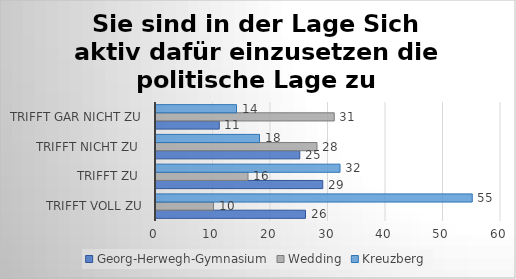
| Category | Georg-Herwegh-Gymnasium | Wedding | Kreuzberg |
|---|---|---|---|
| trifft voll zu | 26 | 10 | 55 |
| trifft zu  | 29 | 16 | 32 |
| trifft nicht zu  | 25 | 28 | 18 |
| trifft gar nicht zu | 11 | 31 | 14 |